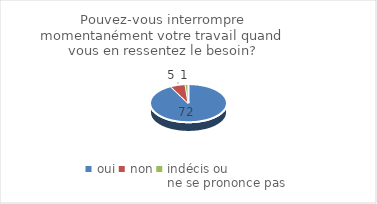
| Category | Pouvez-vous interrompre momentanément votre travail quand vous en ressentez le besoin? |
|---|---|
| oui | 72 |
| non | 5 |
| indécis ou 
ne se prononce pas | 1 |